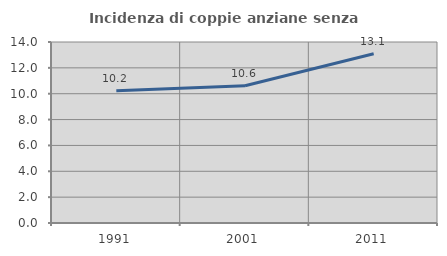
| Category | Incidenza di coppie anziane senza figli  |
|---|---|
| 1991.0 | 10.227 |
| 2001.0 | 10.615 |
| 2011.0 | 13.095 |